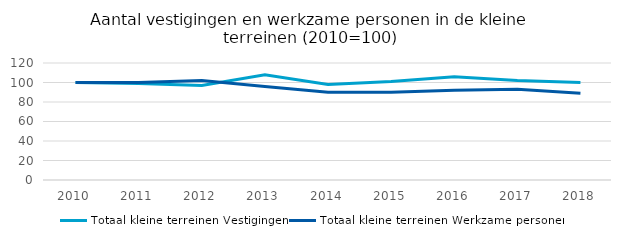
| Category | Totaal kleine terreinen |
|---|---|
| 2010.0 | 100 |
| 2011.0 | 100 |
| 2012.0 | 102 |
| 2013.0 | 96 |
| 2014.0 | 90 |
| 2015.0 | 90 |
| 2016.0 | 92 |
| 2017.0 | 93 |
| 2018.0 | 89 |